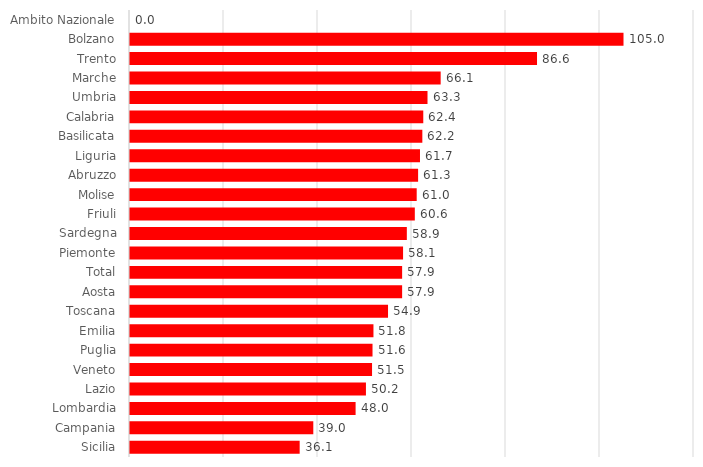
| Category | Series 0 |
|---|---|
| Ambito Nazionale | 0 |
| Bolzano | 105 |
| Trento | 86.6 |
| Marche | 66.1 |
| Umbria | 63.3 |
| Calabria | 62.4 |
| Basilicata | 62.2 |
| Liguria | 61.7 |
| Abruzzo | 61.3 |
| Molise | 61 |
| Friuli | 60.6 |
| Sardegna | 58.9 |
| Piemonte | 58.1 |
| Total | 57.9 |
| Aosta | 57.9 |
| Toscana | 54.9 |
| Emilia | 51.8 |
| Puglia | 51.6 |
| Veneto | 51.5 |
| Lazio | 50.2 |
| Lombardia | 48 |
| Campania | 39 |
| Sicilia | 36.1 |